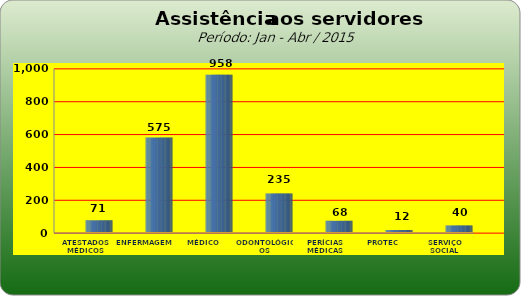
| Category | Series 0 |
|---|---|
| ATESTADOS MÉDICOS | 71 |
| ENFERMAGEM | 575 |
| MÉDICO | 958 |
| ODONTOLÓGICOS | 235 |
| PERÍCIAS MÉDICAS | 68 |
| PROTEC | 12 |
| SERVIÇO SOCIAL | 40 |